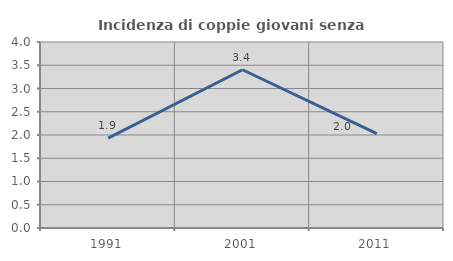
| Category | Incidenza di coppie giovani senza figli |
|---|---|
| 1991.0 | 1.932 |
| 2001.0 | 3.404 |
| 2011.0 | 2.028 |